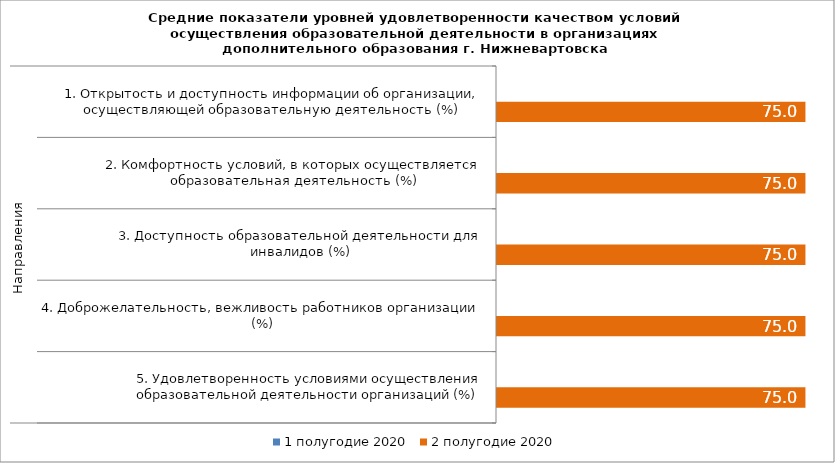
| Category | 1 полугодие 2020 | 2 полугодие 2020 |
|---|---|---|
| 0 | 0 | 75 |
| 1 | 0 | 75 |
| 2 | 0 | 75 |
| 3 | 0 | 75 |
| 4 | 0 | 75 |